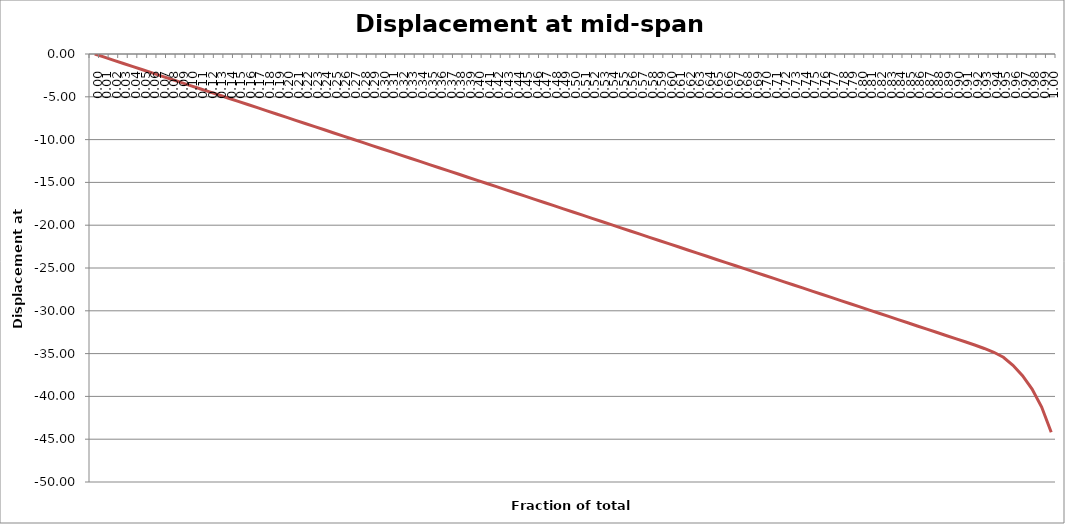
| Category | Displacement at mid-span [mm] |
|---|---|
| 0.0 | 0 |
| 0.01 | -0.369 |
| 0.02 | -0.738 |
| 0.03 | -1.106 |
| 0.04 | -1.475 |
| 0.05 | -1.844 |
| 0.06 | -2.213 |
| 0.06999999999999999 | -2.582 |
| 0.08 | -2.95 |
| 0.09 | -3.319 |
| 0.1 | -3.688 |
| 0.11000000000000001 | -4.057 |
| 0.12 | -4.426 |
| 0.13 | -4.795 |
| 0.13999999999999999 | -5.164 |
| 0.15 | -5.533 |
| 0.16 | -5.902 |
| 0.16999999999999998 | -6.271 |
| 0.18 | -6.64 |
| 0.19 | -7.009 |
| 0.2 | -7.378 |
| 0.21000000000000002 | -7.747 |
| 0.22000000000000003 | -8.116 |
| 0.22999999999999998 | -8.485 |
| 0.24 | -8.854 |
| 0.25 | -9.224 |
| 0.26 | -9.593 |
| 0.27 | -9.962 |
| 0.27999999999999997 | -10.331 |
| 0.29 | -10.7 |
| 0.3 | -11.069 |
| 0.31 | -11.439 |
| 0.32 | -11.808 |
| 0.32999999999999996 | -12.177 |
| 0.33999999999999997 | -12.546 |
| 0.35 | -12.916 |
| 0.36 | -13.285 |
| 0.37 | -13.654 |
| 0.38 | -14.024 |
| 0.39 | -14.393 |
| 0.4 | -14.762 |
| 0.41 | -15.132 |
| 0.42000000000000004 | -15.501 |
| 0.43 | -15.871 |
| 0.44000000000000006 | -16.24 |
| 0.45 | -16.609 |
| 0.45999999999999996 | -16.979 |
| 0.47000000000000003 | -17.348 |
| 0.48 | -17.718 |
| 0.49000000000000005 | -18.087 |
| 0.5 | -18.457 |
| 0.51 | -18.826 |
| 0.52 | -19.196 |
| 0.53 | -19.566 |
| 0.54 | -19.935 |
| 0.55 | -20.305 |
| 0.5599999999999999 | -20.674 |
| 0.5700000000000001 | -21.044 |
| 0.58 | -21.414 |
| 0.5900000000000001 | -21.783 |
| 0.6 | -22.153 |
| 0.61 | -22.523 |
| 0.62 | -22.892 |
| 0.63 | -23.262 |
| 0.64 | -23.632 |
| 0.65 | -24.002 |
| 0.6599999999999999 | -24.371 |
| 0.67 | -24.741 |
| 0.6799999999999999 | -25.111 |
| 0.6900000000000001 | -25.481 |
| 0.7 | -25.851 |
| 0.71 | -26.22 |
| 0.72 | -26.59 |
| 0.73 | -26.96 |
| 0.74 | -27.33 |
| 0.75 | -27.7 |
| 0.76 | -28.07 |
| 0.77 | -28.44 |
| 0.78 | -28.81 |
| 0.79 | -29.18 |
| 0.8 | -29.55 |
| 0.8099999999999999 | -29.92 |
| 0.82 | -30.29 |
| 0.8300000000000001 | -30.66 |
| 0.8400000000000001 | -31.03 |
| 0.85 | -31.4 |
| 0.86 | -31.77 |
| 0.8699999999999999 | -32.14 |
| 0.8800000000000001 | -32.51 |
| 0.89 | -32.88 |
| 0.9 | -33.25 |
| 0.9099999999999999 | -33.621 |
| 0.9199999999999999 | -34 |
| 0.93 | -34.401 |
| 0.9400000000000001 | -34.844 |
| 0.95 | -35.43 |
| 0.96 | -36.362 |
| 0.97 | -37.587 |
| 0.9800000000000001 | -39.15 |
| 0.99 | -41.248 |
| 1.0 | -44.182 |